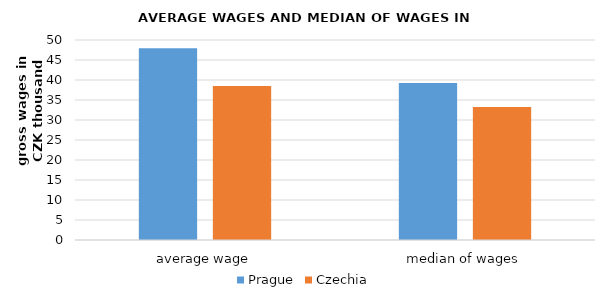
| Category | Prague | Czechia |
|---|---|---|
| average wage | 47924 | 38527 |
| median of wages | 39233 | 33256 |